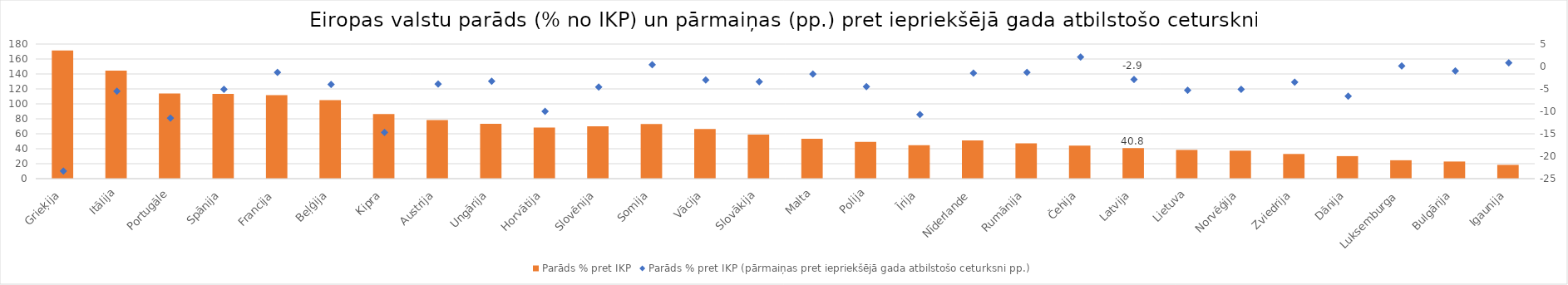
| Category | Parāds % pret IKP |
|---|---|
| Grieķija | 171.3 |
| Itālija | 144.4 |
| Portugāle | 113.9 |
| Spānija | 113.2 |
| Francija | 111.6 |
|  Beļģija | 105.1 |
| Kipra | 86.5 |
| Austrija | 78.4 |
| Ungārija | 73.3 |
| Horvātija | 68.4 |
| Slovēnija | 69.9 |
| Somija | 73 |
| Vācija | 66.3 |
| Slovākija | 58.8 |
| Malta | 53.4 |
| Polija | 49.1 |
| Īrija | 44.7 |
| Nīderlande | 51 |
| Rumānija | 47.3 |
| Čehija | 44.1 |
| Latvija | 40.8 |
| Lietuva | 38.4 |
| Norvēģija | 37.4 |
| Zviedrija | 33 |
| Dānija | 30.1 |
| Luksemburga | 24.6 |
| Bulgārija | 22.9 |
| Igaunija | 18.4 |